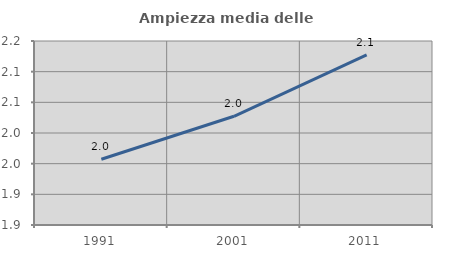
| Category | Ampiezza media delle famiglie |
|---|---|
| 1991.0 | 1.957 |
| 2001.0 | 2.027 |
| 2011.0 | 2.127 |